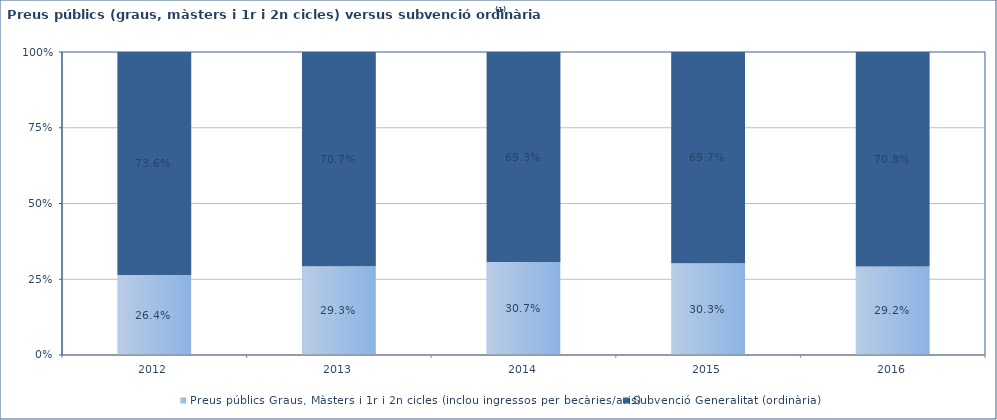
| Category | Preus públics Graus, Màsters i 1r i 2n cicles (inclou ingressos per becàries/aris) | Subvenció Generalitat (ordinària) |
|---|---|---|
| 2012.0 | 0.264 | 0.736 |
| 2013.0 | 0.293 | 0.707 |
| 2014.0 | 0.307 | 0.693 |
| 2015.0 | 0.303 | 0.697 |
| 2016.0 | 0.292 | 0.708 |